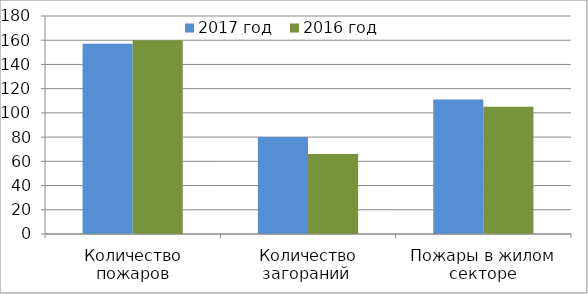
| Category | 2017 год | 2016 год |
|---|---|---|
| Количество пожаров | 157 | 160 |
| Количество загораний  | 80 | 66 |
| Пожары в жилом секторе | 111 | 105 |